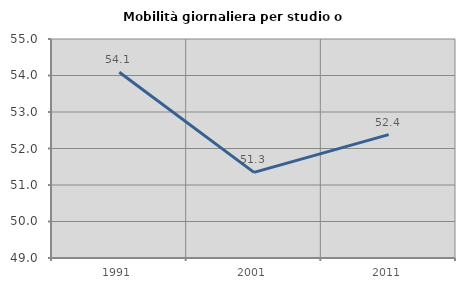
| Category | Mobilità giornaliera per studio o lavoro |
|---|---|
| 1991.0 | 54.09 |
| 2001.0 | 51.345 |
| 2011.0 | 52.381 |